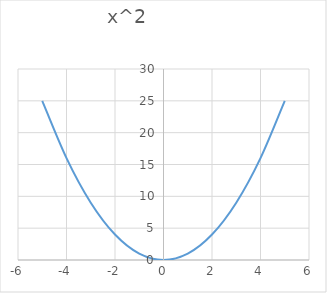
| Category | x^2 |
|---|---|
| -5.0 | 25 |
| -4.0 | 16 |
| -3.0 | 9 |
| -2.0 | 4 |
| -1.0 | 1 |
| 0.0 | 0 |
| 1.0 | 1 |
| 2.0 | 4 |
| 3.0 | 9 |
| 4.0 | 16 |
| 5.0 | 25 |